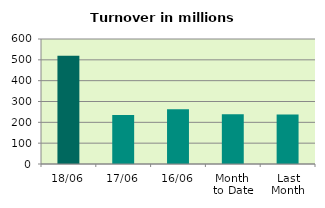
| Category | Series 0 |
|---|---|
| 18/06 | 519.245 |
| 17/06 | 234.878 |
| 16/06 | 263.095 |
| Month 
to Date | 238.707 |
| Last
Month | 237.894 |